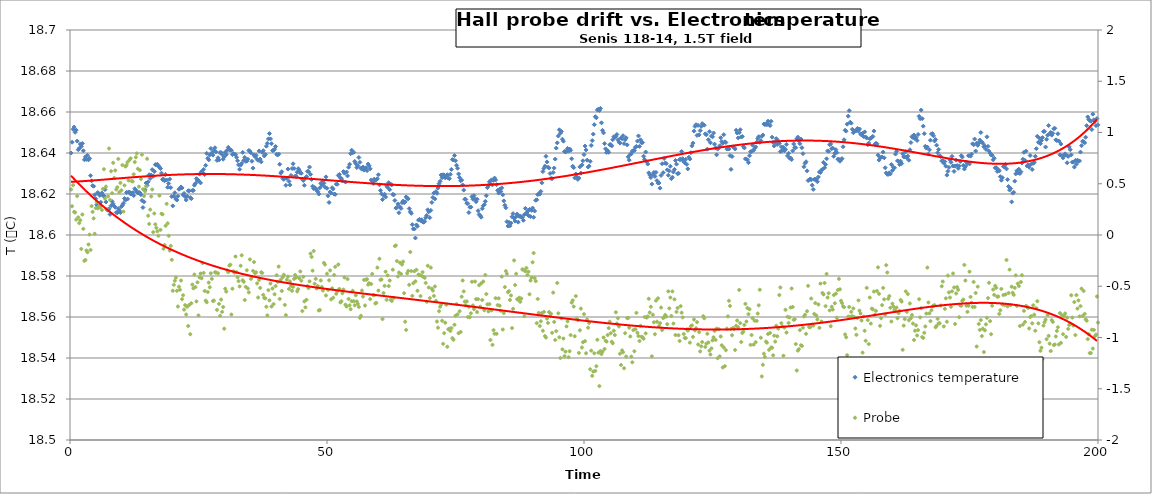
| Category | Electronics temperature |
|---|---|
| 0.2 | 18.64 |
| 0.4 | 18.645 |
| 0.6000000000000001 | 18.652 |
| 0.8 | 18.653 |
| 1.0 | 18.65 |
| 1.2 | 18.651 |
| 1.4 | 18.646 |
| 1.5999999999999999 | 18.642 |
| 1.7999999999999998 | 18.642 |
| 1.9999999999999998 | 18.644 |
| 2.1999999999999997 | 18.643 |
| 2.4 | 18.645 |
| 2.6 | 18.641 |
| 2.8000000000000003 | 18.637 |
| 3.0000000000000004 | 18.638 |
| 3.2000000000000006 | 18.637 |
| 3.400000000000001 | 18.639 |
| 3.600000000000001 | 18.637 |
| 3.800000000000001 | 18.637 |
| 4.000000000000001 | 18.629 |
| 4.200000000000001 | 18.626 |
| 4.400000000000001 | 18.624 |
| 4.600000000000001 | 18.624 |
| 4.800000000000002 | 18.62 |
| 5.000000000000002 | 18.618 |
| 5.200000000000002 | 18.615 |
| 5.400000000000002 | 18.621 |
| 5.600000000000002 | 18.62 |
| 5.8000000000000025 | 18.619 |
| 6.000000000000003 | 18.616 |
| 6.200000000000003 | 18.621 |
| 6.400000000000003 | 18.619 |
| 6.600000000000003 | 18.619 |
| 6.800000000000003 | 18.622 |
| 7.0000000000000036 | 18.616 |
| 7.200000000000004 | 18.612 |
| 7.400000000000004 | 18.612 |
| 7.600000000000004 | 18.613 |
| 7.800000000000004 | 18.61 |
| 8.000000000000004 | 18.614 |
| 8.200000000000003 | 18.616 |
| 8.400000000000002 | 18.615 |
| 8.600000000000001 | 18.614 |
| 8.8 | 18.614 |
| 9.0 | 18.611 |
| 9.2 | 18.611 |
| 9.399999999999999 | 18.613 |
| 9.599999999999998 | 18.612 |
| 9.799999999999997 | 18.611 |
| 9.999999999999996 | 18.614 |
| 10.199999999999996 | 18.615 |
| 10.399999999999995 | 18.615 |
| 10.599999999999994 | 18.618 |
| 10.799999999999994 | 18.617 |
| 10.999999999999993 | 18.621 |
| 11.199999999999992 | 18.618 |
| 11.399999999999991 | 18.621 |
| 11.59999999999999 | 18.621 |
| 11.79999999999999 | 18.62 |
| 11.99999999999999 | 18.62 |
| 12.199999999999989 | 18.621 |
| 12.399999999999988 | 18.619 |
| 12.599999999999987 | 18.623 |
| 12.799999999999986 | 18.622 |
| 12.999999999999986 | 18.621 |
| 13.199999999999985 | 18.621 |
| 13.399999999999984 | 18.621 |
| 13.599999999999984 | 18.621 |
| 13.799999999999983 | 18.62 |
| 13.999999999999982 | 18.617 |
| 14.199999999999982 | 18.613 |
| 14.39999999999998 | 18.616 |
| 14.59999999999998 | 18.622 |
| 14.79999999999998 | 18.625 |
| 14.999999999999979 | 18.624 |
| 15.199999999999978 | 18.626 |
| 15.399999999999977 | 18.629 |
| 15.599999999999977 | 18.628 |
| 15.799999999999976 | 18.629 |
| 15.999999999999975 | 18.632 |
| 16.199999999999974 | 18.629 |
| 16.399999999999974 | 18.631 |
| 16.599999999999973 | 18.634 |
| 16.799999999999972 | 18.634 |
| 16.99999999999997 | 18.635 |
| 17.19999999999997 | 18.634 |
| 17.39999999999997 | 18.633 |
| 17.59999999999997 | 18.632 |
| 17.79999999999997 | 18.63 |
| 17.999999999999968 | 18.627 |
| 18.199999999999967 | 18.627 |
| 18.399999999999967 | 18.626 |
| 18.599999999999966 | 18.63 |
| 18.799999999999965 | 18.627 |
| 18.999999999999964 | 18.623 |
| 19.199999999999964 | 18.625 |
| 19.399999999999963 | 18.627 |
| 19.599999999999962 | 18.623 |
| 19.79999999999996 | 18.619 |
| 19.99999999999996 | 18.614 |
| 20.19999999999996 | 18.619 |
| 20.39999999999996 | 18.621 |
| 20.59999999999996 | 18.618 |
| 20.799999999999958 | 18.617 |
| 20.999999999999957 | 18.619 |
| 21.199999999999957 | 18.622 |
| 21.399999999999956 | 18.623 |
| 21.599999999999955 | 18.623 |
| 21.799999999999955 | 18.623 |
| 21.999999999999954 | 18.62 |
| 22.199999999999953 | 18.62 |
| 22.399999999999952 | 18.619 |
| 22.59999999999995 | 18.617 |
| 22.79999999999995 | 18.619 |
| 22.99999999999995 | 18.622 |
| 23.19999999999995 | 18.622 |
| 23.39999999999995 | 18.618 |
| 23.599999999999948 | 18.618 |
| 23.799999999999947 | 18.622 |
| 23.999999999999947 | 18.622 |
| 24.199999999999946 | 18.624 |
| 24.399999999999945 | 18.625 |
| 24.599999999999945 | 18.627 |
| 24.799999999999944 | 18.627 |
| 24.999999999999943 | 18.627 |
| 25.199999999999942 | 18.63 |
| 25.39999999999994 | 18.625 |
| 25.59999999999994 | 18.631 |
| 25.79999999999994 | 18.63 |
| 25.99999999999994 | 18.632 |
| 26.19999999999994 | 18.629 |
| 26.399999999999938 | 18.634 |
| 26.599999999999937 | 18.64 |
| 26.799999999999937 | 18.637 |
| 26.999999999999936 | 18.637 |
| 27.199999999999935 | 18.639 |
| 27.399999999999935 | 18.642 |
| 27.599999999999934 | 18.64 |
| 27.799999999999933 | 18.639 |
| 27.999999999999932 | 18.641 |
| 28.199999999999932 | 18.643 |
| 28.39999999999993 | 18.641 |
| 28.59999999999993 | 18.636 |
| 28.79999999999993 | 18.638 |
| 28.99999999999993 | 18.637 |
| 29.19999999999993 | 18.64 |
| 29.399999999999928 | 18.64 |
| 29.599999999999927 | 18.639 |
| 29.799999999999926 | 18.637 |
| 29.999999999999925 | 18.638 |
| 30.199999999999925 | 18.64 |
| 30.399999999999924 | 18.639 |
| 30.599999999999923 | 18.641 |
| 30.799999999999923 | 18.643 |
| 30.999999999999922 | 18.642 |
| 31.19999999999992 | 18.641 |
| 31.39999999999992 | 18.641 |
| 31.59999999999992 | 18.639 |
| 31.79999999999992 | 18.64 |
| 31.99999999999992 | 18.639 |
| 32.19999999999992 | 18.639 |
| 32.39999999999992 | 18.638 |
| 32.59999999999992 | 18.636 |
| 32.799999999999926 | 18.634 |
| 32.99999999999993 | 18.632 |
| 33.19999999999993 | 18.634 |
| 33.399999999999935 | 18.635 |
| 33.59999999999994 | 18.64 |
| 33.79999999999994 | 18.636 |
| 33.99999999999994 | 18.638 |
| 34.199999999999946 | 18.636 |
| 34.39999999999995 | 18.636 |
| 34.59999999999995 | 18.637 |
| 34.799999999999955 | 18.641 |
| 34.99999999999996 | 18.641 |
| 35.19999999999996 | 18.64 |
| 35.39999999999996 | 18.636 |
| 35.599999999999966 | 18.633 |
| 35.79999999999997 | 18.639 |
| 35.99999999999997 | 18.638 |
| 36.199999999999974 | 18.639 |
| 36.39999999999998 | 18.637 |
| 36.59999999999998 | 18.636 |
| 36.79999999999998 | 18.641 |
| 36.999999999999986 | 18.637 |
| 37.19999999999999 | 18.636 |
| 37.39999999999999 | 18.64 |
| 37.599999999999994 | 18.641 |
| 37.8 | 18.639 |
| 38.0 | 18.639 |
| 38.2 | 18.643 |
| 38.400000000000006 | 18.645 |
| 38.60000000000001 | 18.647 |
| 38.80000000000001 | 18.649 |
| 39.000000000000014 | 18.647 |
| 39.20000000000002 | 18.645 |
| 39.40000000000002 | 18.641 |
| 39.60000000000002 | 18.641 |
| 39.800000000000026 | 18.642 |
| 40.00000000000003 | 18.643 |
| 40.20000000000003 | 18.639 |
| 40.400000000000034 | 18.639 |
| 40.60000000000004 | 18.639 |
| 40.80000000000004 | 18.635 |
| 41.00000000000004 | 18.63 |
| 41.200000000000045 | 18.631 |
| 41.40000000000005 | 18.628 |
| 41.60000000000005 | 18.627 |
| 41.800000000000054 | 18.628 |
| 42.00000000000006 | 18.624 |
| 42.20000000000006 | 18.628 |
| 42.40000000000006 | 18.632 |
| 42.600000000000065 | 18.626 |
| 42.80000000000007 | 18.624 |
| 43.00000000000007 | 18.629 |
| 43.200000000000074 | 18.632 |
| 43.40000000000008 | 18.635 |
| 43.60000000000008 | 18.632 |
| 43.80000000000008 | 18.629 |
| 44.000000000000085 | 18.629 |
| 44.20000000000009 | 18.631 |
| 44.40000000000009 | 18.632 |
| 44.600000000000094 | 18.632 |
| 44.8000000000001 | 18.63 |
| 45.0000000000001 | 18.63 |
| 45.2000000000001 | 18.627 |
| 45.400000000000105 | 18.627 |
| 45.60000000000011 | 18.624 |
| 45.80000000000011 | 18.628 |
| 46.000000000000114 | 18.628 |
| 46.20000000000012 | 18.631 |
| 46.40000000000012 | 18.631 |
| 46.60000000000012 | 18.633 |
| 46.800000000000125 | 18.63 |
| 47.00000000000013 | 18.627 |
| 47.20000000000013 | 18.624 |
| 47.400000000000134 | 18.623 |
| 47.600000000000136 | 18.623 |
| 47.80000000000014 | 18.623 |
| 48.00000000000014 | 18.622 |
| 48.200000000000145 | 18.621 |
| 48.40000000000015 | 18.62 |
| 48.60000000000015 | 18.623 |
| 48.80000000000015 | 18.625 |
| 49.000000000000156 | 18.624 |
| 49.20000000000016 | 18.626 |
| 49.40000000000016 | 18.625 |
| 49.600000000000165 | 18.623 |
| 49.80000000000017 | 18.628 |
| 50.00000000000017 | 18.623 |
| 50.20000000000017 | 18.619 |
| 50.400000000000176 | 18.616 |
| 50.60000000000018 | 18.621 |
| 50.80000000000018 | 18.621 |
| 51.000000000000185 | 18.623 |
| 51.20000000000019 | 18.622 |
| 51.40000000000019 | 18.62 |
| 51.60000000000019 | 18.62 |
| 51.800000000000196 | 18.625 |
| 52.0000000000002 | 18.625 |
| 52.2000000000002 | 18.629 |
| 52.400000000000205 | 18.63 |
| 52.60000000000021 | 18.628 |
| 52.80000000000021 | 18.627 |
| 53.00000000000021 | 18.626 |
| 53.200000000000216 | 18.631 |
| 53.40000000000022 | 18.63 |
| 53.60000000000022 | 18.626 |
| 53.800000000000225 | 18.631 |
| 54.00000000000023 | 18.629 |
| 54.20000000000023 | 18.633 |
| 54.40000000000023 | 18.635 |
| 54.600000000000236 | 18.64 |
| 54.80000000000024 | 18.641 |
| 55.00000000000024 | 18.64 |
| 55.200000000000244 | 18.64 |
| 55.40000000000025 | 18.636 |
| 55.60000000000025 | 18.635 |
| 55.80000000000025 | 18.633 |
| 56.000000000000256 | 18.634 |
| 56.20000000000026 | 18.638 |
| 56.40000000000026 | 18.635 |
| 56.600000000000264 | 18.633 |
| 56.80000000000027 | 18.632 |
| 57.00000000000027 | 18.633 |
| 57.20000000000027 | 18.632 |
| 57.400000000000276 | 18.633 |
| 57.60000000000028 | 18.633 |
| 57.80000000000028 | 18.631 |
| 58.000000000000284 | 18.635 |
| 58.20000000000029 | 18.634 |
| 58.40000000000029 | 18.632 |
| 58.60000000000029 | 18.627 |
| 58.800000000000296 | 18.626 |
| 59.0000000000003 | 18.625 |
| 59.2000000000003 | 18.627 |
| 59.400000000000304 | 18.627 |
| 59.60000000000031 | 18.627 |
| 59.80000000000031 | 18.627 |
| 60.00000000000031 | 18.629 |
| 60.200000000000315 | 18.624 |
| 60.40000000000032 | 18.622 |
| 60.60000000000032 | 18.62 |
| 60.800000000000324 | 18.617 |
| 61.00000000000033 | 18.619 |
| 61.20000000000033 | 18.62 |
| 61.40000000000033 | 18.619 |
| 61.600000000000335 | 18.624 |
| 61.80000000000034 | 18.623 |
| 62.00000000000034 | 18.626 |
| 62.200000000000344 | 18.622 |
| 62.40000000000035 | 18.625 |
| 62.60000000000035 | 18.624 |
| 62.80000000000035 | 18.62 |
| 63.000000000000355 | 18.62 |
| 63.20000000000036 | 18.617 |
| 63.40000000000036 | 18.613 |
| 63.600000000000364 | 18.613 |
| 63.80000000000037 | 18.615 |
| 64.00000000000037 | 18.611 |
| 64.20000000000037 | 18.614 |
| 64.40000000000038 | 18.613 |
| 64.60000000000038 | 18.616 |
| 64.80000000000038 | 18.617 |
| 65.00000000000038 | 18.616 |
| 65.20000000000039 | 18.616 |
| 65.40000000000039 | 18.619 |
| 65.60000000000039 | 18.618 |
| 65.8000000000004 | 18.618 |
| 66.0000000000004 | 18.613 |
| 66.2000000000004 | 18.611 |
| 66.4000000000004 | 18.611 |
| 66.6000000000004 | 18.605 |
| 66.80000000000041 | 18.603 |
| 67.00000000000041 | 18.603 |
| 67.20000000000041 | 18.599 |
| 67.40000000000042 | 18.605 |
| 67.60000000000042 | 18.604 |
| 67.80000000000042 | 18.607 |
| 68.00000000000043 | 18.608 |
| 68.20000000000043 | 18.607 |
| 68.40000000000043 | 18.607 |
| 68.60000000000043 | 18.606 |
| 68.80000000000044 | 18.606 |
| 69.00000000000044 | 18.607 |
| 69.20000000000044 | 18.608 |
| 69.40000000000045 | 18.61 |
| 69.60000000000045 | 18.612 |
| 69.80000000000045 | 18.611 |
| 70.00000000000045 | 18.608 |
| 70.20000000000046 | 18.612 |
| 70.40000000000046 | 18.616 |
| 70.60000000000046 | 18.618 |
| 70.80000000000047 | 18.62 |
| 71.00000000000047 | 18.618 |
| 71.20000000000047 | 18.621 |
| 71.40000000000047 | 18.62 |
| 71.60000000000048 | 18.623 |
| 71.80000000000048 | 18.625 |
| 72.00000000000048 | 18.626 |
| 72.20000000000049 | 18.629 |
| 72.40000000000049 | 18.628 |
| 72.60000000000049 | 18.629 |
| 72.8000000000005 | 18.629 |
| 73.0000000000005 | 18.628 |
| 73.2000000000005 | 18.629 |
| 73.4000000000005 | 18.629 |
| 73.6000000000005 | 18.628 |
| 73.80000000000051 | 18.627 |
| 74.00000000000051 | 18.63 |
| 74.20000000000051 | 18.632 |
| 74.40000000000052 | 18.637 |
| 74.60000000000052 | 18.637 |
| 74.80000000000052 | 18.639 |
| 75.00000000000053 | 18.636 |
| 75.20000000000053 | 18.634 |
| 75.40000000000053 | 18.633 |
| 75.60000000000053 | 18.63 |
| 75.80000000000054 | 18.628 |
| 76.00000000000054 | 18.626 |
| 76.20000000000054 | 18.627 |
| 76.40000000000055 | 18.624 |
| 76.60000000000055 | 18.622 |
| 76.80000000000055 | 18.617 |
| 77.00000000000055 | 18.617 |
| 77.20000000000056 | 18.615 |
| 77.40000000000056 | 18.615 |
| 77.60000000000056 | 18.611 |
| 77.80000000000057 | 18.614 |
| 78.00000000000057 | 18.614 |
| 78.20000000000057 | 18.619 |
| 78.40000000000057 | 18.617 |
| 78.60000000000058 | 18.619 |
| 78.80000000000058 | 18.617 |
| 79.00000000000058 | 18.616 |
| 79.20000000000059 | 18.617 |
| 79.40000000000059 | 18.612 |
| 79.60000000000059 | 18.61 |
| 79.8000000000006 | 18.609 |
| 80.0000000000006 | 18.609 |
| 80.2000000000006 | 18.613 |
| 80.4000000000006 | 18.614 |
| 80.6000000000006 | 18.615 |
| 80.80000000000061 | 18.616 |
| 81.00000000000061 | 18.619 |
| 81.20000000000061 | 18.623 |
| 81.40000000000062 | 18.624 |
| 81.60000000000062 | 18.626 |
| 81.80000000000062 | 18.625 |
| 82.00000000000063 | 18.627 |
| 82.20000000000063 | 18.624 |
| 82.40000000000063 | 18.627 |
| 82.60000000000063 | 18.628 |
| 82.80000000000064 | 18.627 |
| 83.00000000000064 | 18.625 |
| 83.20000000000064 | 18.622 |
| 83.40000000000065 | 18.62 |
| 83.60000000000065 | 18.622 |
| 83.80000000000065 | 18.621 |
| 84.00000000000065 | 18.623 |
| 84.20000000000066 | 18.62 |
| 84.40000000000066 | 18.617 |
| 84.60000000000066 | 18.615 |
| 84.80000000000067 | 18.613 |
| 85.00000000000067 | 18.607 |
| 85.20000000000067 | 18.604 |
| 85.40000000000067 | 18.606 |
| 85.60000000000068 | 18.604 |
| 85.80000000000068 | 18.606 |
| 86.00000000000068 | 18.609 |
| 86.20000000000068 | 18.61 |
| 86.40000000000069 | 18.608 |
| 86.60000000000069 | 18.607 |
| 86.8000000000007 | 18.609 |
| 87.0000000000007 | 18.61 |
| 87.2000000000007 | 18.606 |
| 87.4000000000007 | 18.609 |
| 87.6000000000007 | 18.609 |
| 87.80000000000071 | 18.609 |
| 88.00000000000071 | 18.608 |
| 88.20000000000071 | 18.607 |
| 88.40000000000072 | 18.61 |
| 88.60000000000072 | 18.613 |
| 88.80000000000072 | 18.61 |
| 89.00000000000072 | 18.611 |
| 89.20000000000073 | 18.609 |
| 89.40000000000073 | 18.612 |
| 89.60000000000073 | 18.609 |
| 89.80000000000074 | 18.612 |
| 90.00000000000074 | 18.613 |
| 90.20000000000074 | 18.609 |
| 90.40000000000074 | 18.612 |
| 90.60000000000075 | 18.617 |
| 90.80000000000075 | 18.617 |
| 91.00000000000075 | 18.62 |
| 91.20000000000076 | 18.62 |
| 91.40000000000076 | 18.62 |
| 91.60000000000076 | 18.621 |
| 91.80000000000076 | 18.625 |
| 92.00000000000077 | 18.631 |
| 92.20000000000077 | 18.632 |
| 92.40000000000077 | 18.634 |
| 92.60000000000078 | 18.638 |
| 92.80000000000078 | 18.636 |
| 93.00000000000078 | 18.633 |
| 93.20000000000078 | 18.633 |
| 93.40000000000079 | 18.63 |
| 93.60000000000079 | 18.628 |
| 93.8000000000008 | 18.627 |
| 94.0000000000008 | 18.63 |
| 94.2000000000008 | 18.633 |
| 94.4000000000008 | 18.637 |
| 94.6000000000008 | 18.642 |
| 94.80000000000081 | 18.645 |
| 95.00000000000081 | 18.648 |
| 95.20000000000081 | 18.651 |
| 95.40000000000082 | 18.65 |
| 95.60000000000082 | 18.65 |
| 95.80000000000082 | 18.647 |
| 96.00000000000082 | 18.646 |
| 96.20000000000083 | 18.641 |
| 96.40000000000083 | 18.641 |
| 96.60000000000083 | 18.641 |
| 96.80000000000084 | 18.642 |
| 97.00000000000084 | 18.641 |
| 97.20000000000084 | 18.642 |
| 97.40000000000084 | 18.641 |
| 97.60000000000085 | 18.637 |
| 97.80000000000085 | 18.634 |
| 98.00000000000085 | 18.633 |
| 98.20000000000086 | 18.628 |
| 98.40000000000086 | 18.63 |
| 98.60000000000086 | 18.628 |
| 98.80000000000086 | 18.627 |
| 99.00000000000087 | 18.628 |
| 99.20000000000087 | 18.633 |
| 99.40000000000087 | 18.63 |
| 99.60000000000088 | 18.634 |
| 99.80000000000088 | 18.636 |
| 100.00000000000088 | 18.639 |
| 100.20000000000088 | 18.643 |
| 100.40000000000089 | 18.641 |
| 100.60000000000089 | 18.636 |
| 100.80000000000089 | 18.633 |
| 101.0000000000009 | 18.634 |
| 101.2000000000009 | 18.636 |
| 101.4000000000009 | 18.644 |
| 101.6000000000009 | 18.646 |
| 101.8000000000009 | 18.649 |
| 102.00000000000091 | 18.654 |
| 102.20000000000091 | 18.658 |
| 102.40000000000092 | 18.657 |
| 102.60000000000092 | 18.661 |
| 102.80000000000092 | 18.661 |
| 103.00000000000092 | 18.661 |
| 103.20000000000093 | 18.662 |
| 103.40000000000093 | 18.655 |
| 103.60000000000093 | 18.651 |
| 103.80000000000094 | 18.65 |
| 104.00000000000094 | 18.645 |
| 104.20000000000094 | 18.642 |
| 104.40000000000094 | 18.64 |
| 104.60000000000095 | 18.641 |
| 104.80000000000095 | 18.64 |
| 105.00000000000095 | 18.644 |
| 105.20000000000095 | 18.644 |
| 105.40000000000096 | 18.643 |
| 105.60000000000096 | 18.646 |
| 105.80000000000096 | 18.648 |
| 106.00000000000097 | 18.648 |
| 106.20000000000097 | 18.648 |
| 106.40000000000097 | 18.649 |
| 106.60000000000097 | 18.647 |
| 106.80000000000098 | 18.645 |
| 107.00000000000098 | 18.645 |
| 107.20000000000098 | 18.647 |
| 107.40000000000099 | 18.647 |
| 107.60000000000099 | 18.648 |
| 107.80000000000099 | 18.645 |
| 108.000000000001 | 18.647 |
| 108.200000000001 | 18.647 |
| 108.400000000001 | 18.644 |
| 108.600000000001 | 18.638 |
| 108.800000000001 | 18.637 |
| 109.00000000000101 | 18.639 |
| 109.20000000000101 | 18.64 |
| 109.40000000000101 | 18.641 |
| 109.60000000000102 | 18.641 |
| 109.80000000000102 | 18.641 |
| 110.00000000000102 | 18.643 |
| 110.20000000000103 | 18.643 |
| 110.40000000000103 | 18.646 |
| 110.60000000000103 | 18.648 |
| 110.80000000000103 | 18.643 |
| 111.00000000000104 | 18.646 |
| 111.20000000000104 | 18.645 |
| 111.40000000000104 | 18.645 |
| 111.60000000000105 | 18.638 |
| 111.80000000000105 | 18.637 |
| 112.00000000000105 | 18.64 |
| 112.20000000000105 | 18.636 |
| 112.40000000000106 | 18.635 |
| 112.60000000000106 | 18.63 |
| 112.80000000000106 | 18.629 |
| 113.00000000000107 | 18.628 |
| 113.20000000000107 | 18.625 |
| 113.40000000000107 | 18.629 |
| 113.60000000000107 | 18.631 |
| 113.80000000000108 | 18.629 |
| 114.00000000000108 | 18.631 |
| 114.20000000000108 | 18.626 |
| 114.40000000000109 | 18.625 |
| 114.60000000000109 | 18.625 |
| 114.80000000000109 | 18.623 |
| 115.0000000000011 | 18.629 |
| 115.2000000000011 | 18.635 |
| 115.4000000000011 | 18.63 |
| 115.6000000000011 | 18.637 |
| 115.8000000000011 | 18.635 |
| 116.00000000000111 | 18.635 |
| 116.20000000000111 | 18.632 |
| 116.40000000000111 | 18.629 |
| 116.60000000000112 | 18.631 |
| 116.80000000000112 | 18.634 |
| 117.00000000000112 | 18.627 |
| 117.20000000000113 | 18.628 |
| 117.40000000000113 | 18.631 |
| 117.60000000000113 | 18.632 |
| 117.80000000000113 | 18.636 |
| 118.00000000000114 | 18.635 |
| 118.20000000000114 | 18.63 |
| 118.40000000000114 | 18.63 |
| 118.60000000000115 | 18.637 |
| 118.80000000000115 | 18.637 |
| 119.00000000000115 | 18.641 |
| 119.20000000000115 | 18.637 |
| 119.40000000000116 | 18.636 |
| 119.60000000000116 | 18.635 |
| 119.80000000000116 | 18.637 |
| 120.00000000000117 | 18.634 |
| 120.20000000000117 | 18.632 |
| 120.40000000000117 | 18.638 |
| 120.60000000000117 | 18.637 |
| 120.80000000000118 | 18.64 |
| 121.00000000000118 | 18.643 |
| 121.20000000000118 | 18.645 |
| 121.40000000000119 | 18.651 |
| 121.60000000000119 | 18.653 |
| 121.80000000000119 | 18.654 |
| 122.0000000000012 | 18.649 |
| 122.2000000000012 | 18.653 |
| 122.4000000000012 | 18.649 |
| 122.6000000000012 | 18.651 |
| 122.8000000000012 | 18.653 |
| 123.00000000000121 | 18.654 |
| 123.20000000000121 | 18.654 |
| 123.40000000000121 | 18.654 |
| 123.60000000000122 | 18.649 |
| 123.80000000000122 | 18.649 |
| 124.00000000000122 | 18.642 |
| 124.20000000000122 | 18.646 |
| 124.40000000000123 | 18.65 |
| 124.60000000000123 | 18.645 |
| 124.80000000000123 | 18.648 |
| 125.00000000000124 | 18.648 |
| 125.20000000000124 | 18.65 |
| 125.40000000000124 | 18.644 |
| 125.60000000000124 | 18.643 |
| 125.80000000000125 | 18.639 |
| 126.00000000000125 | 18.642 |
| 126.20000000000125 | 18.642 |
| 126.40000000000126 | 18.644 |
| 126.60000000000126 | 18.647 |
| 126.80000000000126 | 18.646 |
| 127.00000000000126 | 18.645 |
| 127.20000000000127 | 18.649 |
| 127.40000000000127 | 18.645 |
| 127.60000000000127 | 18.645 |
| 127.80000000000128 | 18.642 |
| 128.00000000000128 | 18.643 |
| 128.20000000000127 | 18.642 |
| 128.40000000000126 | 18.639 |
| 128.60000000000124 | 18.632 |
| 128.80000000000123 | 18.638 |
| 129.00000000000122 | 18.643 |
| 129.2000000000012 | 18.643 |
| 129.4000000000012 | 18.642 |
| 129.6000000000012 | 18.651 |
| 129.80000000000118 | 18.65 |
| 130.00000000000117 | 18.647 |
| 130.20000000000115 | 18.65 |
| 130.40000000000114 | 18.651 |
| 130.60000000000113 | 18.648 |
| 130.80000000000112 | 18.648 |
| 131.0000000000011 | 18.643 |
| 131.2000000000011 | 18.642 |
| 131.40000000000109 | 18.637 |
| 131.60000000000107 | 18.637 |
| 131.80000000000106 | 18.637 |
| 132.00000000000105 | 18.635 |
| 132.20000000000104 | 18.639 |
| 132.40000000000103 | 18.641 |
| 132.60000000000102 | 18.641 |
| 132.800000000001 | 18.644 |
| 133.000000000001 | 18.641 |
| 133.20000000000098 | 18.642 |
| 133.40000000000097 | 18.643 |
| 133.60000000000096 | 18.645 |
| 133.80000000000095 | 18.647 |
| 134.00000000000094 | 18.648 |
| 134.20000000000093 | 18.645 |
| 134.40000000000092 | 18.646 |
| 134.6000000000009 | 18.648 |
| 134.8000000000009 | 18.649 |
| 135.00000000000088 | 18.654 |
| 135.20000000000087 | 18.654 |
| 135.40000000000086 | 18.654 |
| 135.60000000000085 | 18.654 |
| 135.80000000000084 | 18.656 |
| 136.00000000000082 | 18.654 |
| 136.2000000000008 | 18.653 |
| 136.4000000000008 | 18.655 |
| 136.6000000000008 | 18.648 |
| 136.80000000000078 | 18.645 |
| 137.00000000000077 | 18.643 |
| 137.20000000000076 | 18.645 |
| 137.40000000000074 | 18.647 |
| 137.60000000000073 | 18.644 |
| 137.80000000000072 | 18.646 |
| 138.0000000000007 | 18.645 |
| 138.2000000000007 | 18.641 |
| 138.4000000000007 | 18.643 |
| 138.60000000000068 | 18.641 |
| 138.80000000000067 | 18.643 |
| 139.00000000000065 | 18.641 |
| 139.20000000000064 | 18.642 |
| 139.40000000000063 | 18.644 |
| 139.60000000000062 | 18.639 |
| 139.8000000000006 | 18.64 |
| 140.0000000000006 | 18.637 |
| 140.20000000000059 | 18.638 |
| 140.40000000000057 | 18.637 |
| 140.60000000000056 | 18.641 |
| 140.80000000000055 | 18.644 |
| 141.00000000000054 | 18.643 |
| 141.20000000000053 | 18.643 |
| 141.40000000000052 | 18.647 |
| 141.6000000000005 | 18.648 |
| 141.8000000000005 | 18.646 |
| 142.00000000000048 | 18.645 |
| 142.20000000000047 | 18.647 |
| 142.40000000000046 | 18.643 |
| 142.60000000000045 | 18.64 |
| 142.80000000000044 | 18.633 |
| 143.00000000000043 | 18.635 |
| 143.20000000000041 | 18.636 |
| 143.4000000000004 | 18.631 |
| 143.6000000000004 | 18.627 |
| 143.80000000000038 | 18.627 |
| 144.00000000000037 | 18.627 |
| 144.20000000000036 | 18.627 |
| 144.40000000000035 | 18.624 |
| 144.60000000000034 | 18.622 |
| 144.80000000000032 | 18.627 |
| 145.0000000000003 | 18.627 |
| 145.2000000000003 | 18.627 |
| 145.4000000000003 | 18.626 |
| 145.60000000000028 | 18.628 |
| 145.80000000000027 | 18.631 |
| 146.00000000000026 | 18.63 |
| 146.20000000000024 | 18.632 |
| 146.40000000000023 | 18.632 |
| 146.60000000000022 | 18.635 |
| 146.8000000000002 | 18.633 |
| 147.0000000000002 | 18.634 |
| 147.2000000000002 | 18.637 |
| 147.40000000000018 | 18.641 |
| 147.60000000000016 | 18.641 |
| 147.80000000000015 | 18.644 |
| 148.00000000000014 | 18.644 |
| 148.20000000000013 | 18.642 |
| 148.40000000000012 | 18.642 |
| 148.6000000000001 | 18.638 |
| 148.8000000000001 | 18.64 |
| 149.00000000000009 | 18.642 |
| 149.20000000000007 | 18.64 |
| 149.40000000000006 | 18.637 |
| 149.60000000000005 | 18.637 |
| 149.80000000000004 | 18.636 |
| 150.00000000000003 | 18.637 |
| 150.20000000000002 | 18.637 |
| 150.4 | 18.643 |
| 150.6 | 18.646 |
| 150.79999999999998 | 18.651 |
| 150.99999999999997 | 18.651 |
| 151.19999999999996 | 18.654 |
| 151.39999999999995 | 18.658 |
| 151.59999999999994 | 18.661 |
| 151.79999999999993 | 18.655 |
| 151.99999999999991 | 18.655 |
| 152.1999999999999 | 18.652 |
| 152.3999999999999 | 18.65 |
| 152.59999999999988 | 18.651 |
| 152.79999999999987 | 18.651 |
| 152.99999999999986 | 18.651 |
| 153.19999999999985 | 18.652 |
| 153.39999999999984 | 18.651 |
| 153.59999999999982 | 18.652 |
| 153.7999999999998 | 18.649 |
| 153.9999999999998 | 18.649 |
| 154.1999999999998 | 18.65 |
| 154.39999999999978 | 18.648 |
| 154.59999999999977 | 18.65 |
| 154.79999999999976 | 18.648 |
| 154.99999999999974 | 18.647 |
| 155.19999999999973 | 18.644 |
| 155.39999999999972 | 18.645 |
| 155.5999999999997 | 18.647 |
| 155.7999999999997 | 18.647 |
| 155.9999999999997 | 18.648 |
| 156.19999999999968 | 18.648 |
| 156.39999999999966 | 18.651 |
| 156.59999999999965 | 18.644 |
| 156.79999999999964 | 18.645 |
| 156.99999999999963 | 18.644 |
| 157.19999999999962 | 18.639 |
| 157.3999999999996 | 18.637 |
| 157.5999999999996 | 18.638 |
| 157.79999999999959 | 18.638 |
| 157.99999999999957 | 18.638 |
| 158.19999999999956 | 18.64 |
| 158.39999999999955 | 18.638 |
| 158.59999999999954 | 18.633 |
| 158.79999999999953 | 18.63 |
| 158.99999999999952 | 18.63 |
| 159.1999999999995 | 18.63 |
| 159.3999999999995 | 18.63 |
| 159.59999999999948 | 18.63 |
| 159.79999999999947 | 18.634 |
| 159.99999999999946 | 18.631 |
| 160.19999999999945 | 18.633 |
| 160.39999999999944 | 18.633 |
| 160.59999999999943 | 18.639 |
| 160.79999999999941 | 18.641 |
| 160.9999999999994 | 18.636 |
| 161.1999999999994 | 18.636 |
| 161.39999999999938 | 18.634 |
| 161.59999999999937 | 18.636 |
| 161.79999999999936 | 18.635 |
| 161.99999999999935 | 18.64 |
| 162.19999999999933 | 18.638 |
| 162.39999999999932 | 18.638 |
| 162.5999999999993 | 18.641 |
| 162.7999999999993 | 18.638 |
| 162.9999999999993 | 18.638 |
| 163.19999999999928 | 18.636 |
| 163.39999999999927 | 18.642 |
| 163.59999999999926 | 18.645 |
| 163.79999999999924 | 18.648 |
| 163.99999999999923 | 18.648 |
| 164.19999999999922 | 18.649 |
| 164.3999999999992 | 18.647 |
| 164.5999999999992 | 18.648 |
| 164.7999999999992 | 18.646 |
| 164.99999999999918 | 18.649 |
| 165.19999999999916 | 18.658 |
| 165.39999999999915 | 18.657 |
| 165.59999999999914 | 18.661 |
| 165.79999999999913 | 18.657 |
| 165.99999999999912 | 18.653 |
| 166.1999999999991 | 18.649 |
| 166.3999999999991 | 18.643 |
| 166.59999999999908 | 18.642 |
| 166.79999999999907 | 18.643 |
| 166.99999999999906 | 18.639 |
| 167.19999999999905 | 18.642 |
| 167.39999999999904 | 18.646 |
| 167.59999999999903 | 18.649 |
| 167.79999999999902 | 18.649 |
| 167.999999999999 | 18.648 |
| 168.199999999999 | 18.646 |
| 168.39999999999898 | 18.647 |
| 168.59999999999897 | 18.644 |
| 168.79999999999896 | 18.64 |
| 168.99999999999895 | 18.642 |
| 169.19999999999894 | 18.639 |
| 169.39999999999893 | 18.638 |
| 169.59999999999891 | 18.636 |
| 169.7999999999989 | 18.636 |
| 169.9999999999989 | 18.635 |
| 170.19999999999888 | 18.636 |
| 170.39999999999887 | 18.634 |
| 170.59999999999886 | 18.629 |
| 170.79999999999885 | 18.631 |
| 170.99999999999883 | 18.633 |
| 171.19999999999882 | 18.637 |
| 171.3999999999988 | 18.635 |
| 171.5999999999988 | 18.638 |
| 171.7999999999988 | 18.634 |
| 171.99999999999878 | 18.631 |
| 172.19999999999877 | 18.634 |
| 172.39999999999876 | 18.637 |
| 172.59999999999874 | 18.634 |
| 172.79999999999873 | 18.632 |
| 172.99999999999872 | 18.634 |
| 173.1999999999987 | 18.636 |
| 173.3999999999987 | 18.639 |
| 173.5999999999987 | 18.638 |
| 173.79999999999868 | 18.634 |
| 173.99999999999866 | 18.632 |
| 174.19999999999865 | 18.633 |
| 174.39999999999864 | 18.636 |
| 174.59999999999863 | 18.635 |
| 174.79999999999862 | 18.639 |
| 174.9999999999986 | 18.635 |
| 175.1999999999986 | 18.638 |
| 175.39999999999858 | 18.64 |
| 175.59999999999857 | 18.644 |
| 175.79999999999856 | 18.644 |
| 175.99999999999855 | 18.647 |
| 176.19999999999854 | 18.641 |
| 176.39999999999853 | 18.645 |
| 176.59999999999852 | 18.644 |
| 176.7999999999985 | 18.645 |
| 176.9999999999985 | 18.646 |
| 177.19999999999848 | 18.65 |
| 177.39999999999847 | 18.645 |
| 177.59999999999846 | 18.645 |
| 177.79999999999845 | 18.643 |
| 177.99999999999844 | 18.643 |
| 178.19999999999843 | 18.642 |
| 178.3999999999984 | 18.648 |
| 178.5999999999984 | 18.643 |
| 178.7999999999984 | 18.641 |
| 178.99999999999838 | 18.64 |
| 179.19999999999837 | 18.639 |
| 179.39999999999836 | 18.639 |
| 179.59999999999835 | 18.637 |
| 179.79999999999833 | 18.637 |
| 179.99999999999832 | 18.633 |
| 180.1999999999983 | 18.633 |
| 180.3999999999983 | 18.631 |
| 180.5999999999983 | 18.632 |
| 180.79999999999828 | 18.631 |
| 180.99999999999827 | 18.628 |
| 181.19999999999825 | 18.627 |
| 181.39999999999824 | 18.628 |
| 181.59999999999823 | 18.633 |
| 181.79999999999822 | 18.633 |
| 181.9999999999982 | 18.634 |
| 182.1999999999982 | 18.632 |
| 182.3999999999982 | 18.627 |
| 182.59999999999818 | 18.624 |
| 182.79999999999816 | 18.622 |
| 182.99999999999815 | 18.623 |
| 183.19999999999814 | 18.616 |
| 183.39999999999813 | 18.62 |
| 183.59999999999812 | 18.621 |
| 183.7999999999981 | 18.626 |
| 183.9999999999981 | 18.63 |
| 184.19999999999808 | 18.631 |
| 184.39999999999807 | 18.63 |
| 184.59999999999806 | 18.632 |
| 184.79999999999805 | 18.63 |
| 184.99999999999804 | 18.631 |
| 185.19999999999803 | 18.635 |
| 185.39999999999802 | 18.637 |
| 185.599999999998 | 18.64 |
| 185.799999999998 | 18.636 |
| 185.99999999999798 | 18.641 |
| 186.19999999999797 | 18.634 |
| 186.39999999999796 | 18.634 |
| 186.59999999999795 | 18.633 |
| 186.79999999999794 | 18.639 |
| 186.99999999999793 | 18.635 |
| 187.1999999999979 | 18.632 |
| 187.3999999999979 | 18.635 |
| 187.5999999999979 | 18.635 |
| 187.79999999999788 | 18.638 |
| 187.99999999999787 | 18.642 |
| 188.19999999999786 | 18.648 |
| 188.39999999999785 | 18.645 |
| 188.59999999999783 | 18.647 |
| 188.79999999999782 | 18.645 |
| 188.9999999999978 | 18.646 |
| 189.1999999999978 | 18.648 |
| 189.3999999999978 | 18.65 |
| 189.59999999999778 | 18.651 |
| 189.79999999999777 | 18.643 |
| 189.99999999999775 | 18.647 |
| 190.19999999999774 | 18.649 |
| 190.39999999999773 | 18.653 |
| 190.59999999999772 | 18.649 |
| 190.7999999999977 | 18.65 |
| 190.9999999999977 | 18.649 |
| 191.1999999999977 | 18.65 |
| 191.39999999999768 | 18.652 |
| 191.59999999999766 | 18.652 |
| 191.79999999999765 | 18.646 |
| 191.99999999999764 | 18.646 |
| 192.19999999999763 | 18.649 |
| 192.39999999999762 | 18.646 |
| 192.5999999999976 | 18.639 |
| 192.7999999999976 | 18.644 |
| 192.99999999999758 | 18.639 |
| 193.19999999999757 | 18.638 |
| 193.39999999999756 | 18.639 |
| 193.59999999999755 | 18.64 |
| 193.79999999999754 | 18.639 |
| 193.99999999999753 | 18.635 |
| 194.19999999999752 | 18.638 |
| 194.3999999999975 | 18.643 |
| 194.5999999999975 | 18.642 |
| 194.79999999999748 | 18.639 |
| 194.99999999999747 | 18.636 |
| 195.19999999999746 | 18.636 |
| 195.39999999999745 | 18.633 |
| 195.59999999999744 | 18.636 |
| 195.79999999999742 | 18.635 |
| 195.9999999999974 | 18.636 |
| 196.1999999999974 | 18.636 |
| 196.3999999999974 | 18.636 |
| 196.59999999999738 | 18.64 |
| 196.79999999999737 | 18.644 |
| 196.99999999999736 | 18.646 |
| 197.19999999999735 | 18.646 |
| 197.39999999999733 | 18.645 |
| 197.59999999999732 | 18.648 |
| 197.7999999999973 | 18.653 |
| 197.9999999999973 | 18.658 |
| 198.1999999999973 | 18.656 |
| 198.39999999999728 | 18.656 |
| 198.59999999999727 | 18.656 |
| 198.79999999999725 | 18.651 |
| 198.99999999999724 | 18.659 |
| 199.19999999999723 | 18.656 |
| 199.39999999999722 | 18.655 |
| 199.5999999999972 | 18.653 |
| 199.7999999999972 | 18.657 |
| 199.9999999999972 | 18.654 |